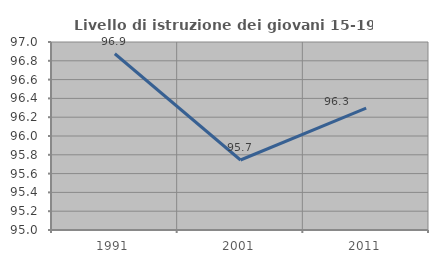
| Category | Livello di istruzione dei giovani 15-19 anni |
|---|---|
| 1991.0 | 96.875 |
| 2001.0 | 95.745 |
| 2011.0 | 96.296 |